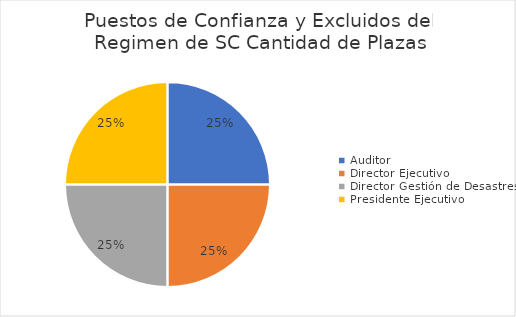
| Category | Puestos de Confianza y Excluidos del Regimen de SC |
|---|---|
| Auditor | 1 |
| Director Ejecutivo | 1 |
| Director Gestión de Desastres | 1 |
| Presidente Ejecutivo | 1 |